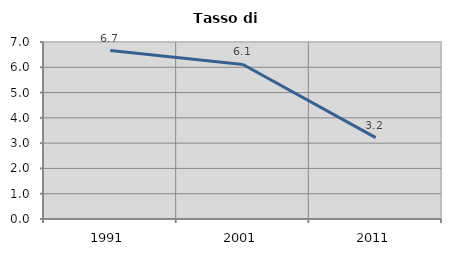
| Category | Tasso di disoccupazione   |
|---|---|
| 1991.0 | 6.661 |
| 2001.0 | 6.111 |
| 2011.0 | 3.217 |